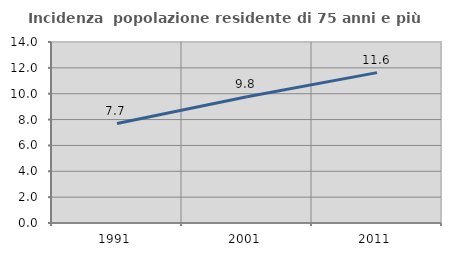
| Category | Incidenza  popolazione residente di 75 anni e più |
|---|---|
| 1991.0 | 7.694 |
| 2001.0 | 9.759 |
| 2011.0 | 11.632 |